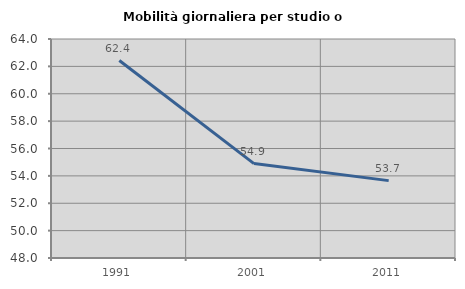
| Category | Mobilità giornaliera per studio o lavoro |
|---|---|
| 1991.0 | 62.427 |
| 2001.0 | 54.897 |
| 2011.0 | 53.652 |